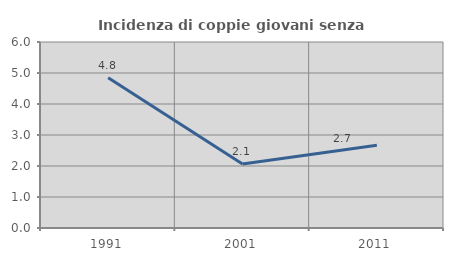
| Category | Incidenza di coppie giovani senza figli |
|---|---|
| 1991.0 | 4.846 |
| 2001.0 | 2.065 |
| 2011.0 | 2.668 |